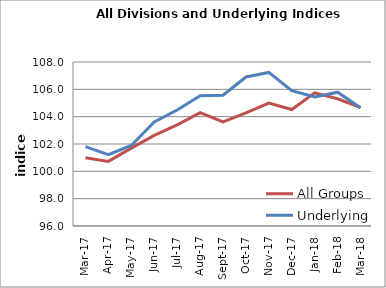
| Category | All Groups | Underlying |
|---|---|---|
| 2017-03-01 | 100.999 | 101.809 |
| 2017-04-01 | 100.727 | 101.214 |
| 2017-05-01 | 101.699 | 101.894 |
| 2017-06-01 | 102.633 | 103.613 |
| 2017-07-01 | 103.397 | 104.483 |
| 2017-08-01 | 104.291 | 105.536 |
| 2017-09-01 | 103.612 | 105.565 |
| 2017-10-01 | 104.27 | 106.905 |
| 2017-11-01 | 104.991 | 107.237 |
| 2017-12-01 | 104.521 | 105.901 |
| 2018-01-01 | 105.739 | 105.443 |
| 2018-02-01 | 105.308 | 105.79 |
| 2018-03-01 | 104.655 | 104.651 |